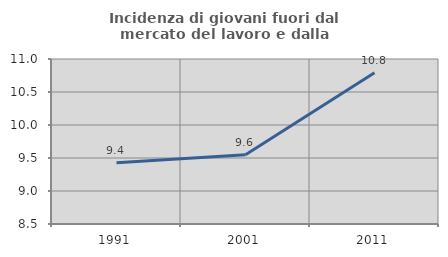
| Category | Incidenza di giovani fuori dal mercato del lavoro e dalla formazione  |
|---|---|
| 1991.0 | 9.43 |
| 2001.0 | 9.551 |
| 2011.0 | 10.791 |